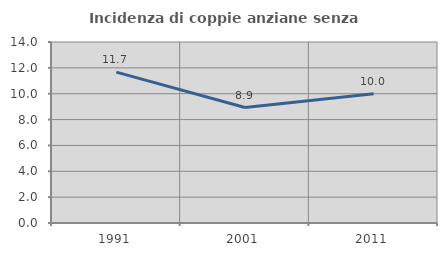
| Category | Incidenza di coppie anziane senza figli  |
|---|---|
| 1991.0 | 11.667 |
| 2001.0 | 8.929 |
| 2011.0 | 10 |